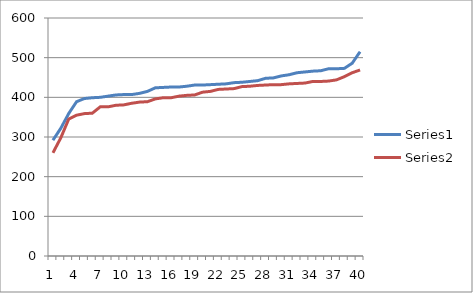
| Category | Series 0 | Series 1 |
|---|---|---|
| 0 | 292 | 260 |
| 1 | 322 | 298 |
| 2 | 359 | 345 |
| 3 | 389 | 355 |
| 4 | 397 | 359 |
| 5 | 399 | 360 |
| 6 | 400 | 376 |
| 7 | 403 | 376 |
| 8 | 406 | 380 |
| 9 | 407 | 381 |
| 10 | 407 | 385 |
| 11 | 410 | 388 |
| 12 | 415 | 389 |
| 13 | 424 | 396 |
| 14 | 425 | 399 |
| 15 | 426 | 399 |
| 16 | 426 | 403 |
| 17 | 428 | 405 |
| 18 | 431 | 406 |
| 19 | 431 | 413 |
| 20 | 432 | 415 |
| 21 | 433 | 420 |
| 22 | 434 | 421 |
| 23 | 437 | 422 |
| 24 | 438 | 427 |
| 25 | 440 | 428 |
| 26 | 442 | 430 |
| 27 | 448 | 431 |
| 28 | 449 | 432 |
| 29 | 454 | 432 |
| 30 | 457 | 434 |
| 31 | 462 | 435 |
| 32 | 464 | 436 |
| 33 | 466 | 440 |
| 34 | 467 | 440 |
| 35 | 472 | 441 |
| 36 | 472 | 444 |
| 37 | 473 | 452 |
| 38 | 486 | 462 |
| 39 | 515 | 469 |